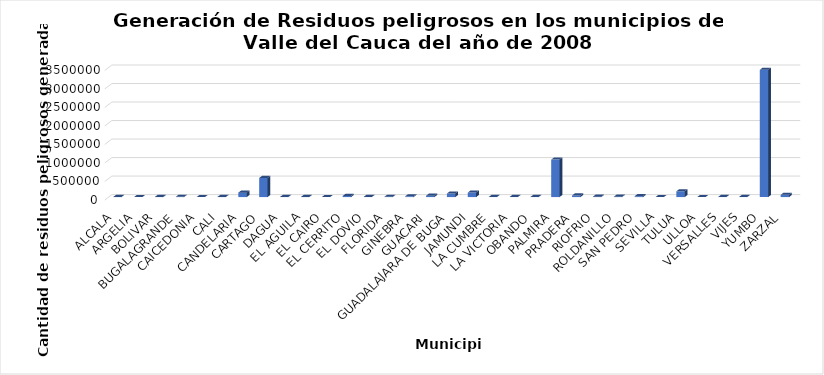
| Category | Series 0 |
|---|---|
| ALCALA | 2143.15 |
| ARGELIA | 70 |
| BOLIVAR | 4011.5 |
| BUGALAGRANDE | 6664 |
| CAICEDONIA | 39 |
| CALI | 3726 |
| CANDELARIA | 120159.6 |
| CARTAGO | 515067.49 |
| DAGUA | 4142.2 |
| EL AGUILA | 3586 |
| EL CAIRO | 819 |
| EL CERRITO | 29838.45 |
| EL DOVIO | 1489 |
| FLORIDA | 7377 |
| GINEBRA | 21197 |
| GUACARI | 36220.3 |
| GUADALAJARA DE BUGA | 95628.08 |
| JAMUNDI | 122269 |
| LA CUMBRE | 1476 |
| LA VICTORIA | 1392 |
| OBANDO | 1560 |
| PALMIRA | 1012080.04 |
| PRADERA | 42817.93 |
| RIOFRIO | 11021 |
| ROLDANILLO | 8455.75 |
| SAN PEDRO | 22437.6 |
| SEVILLA | 675 |
| TULUA | 156233.86 |
| ULLOA | 592.27 |
| VERSALLES | 1582 |
| VIJES | 1540 |
| YUMBO | 3436285.11 |
| ZARZAL | 59718 |